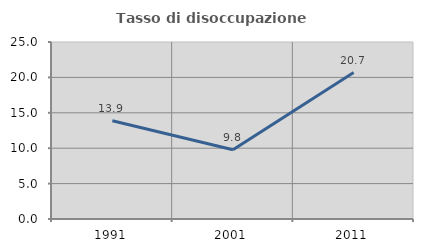
| Category | Tasso di disoccupazione giovanile  |
|---|---|
| 1991.0 | 13.885 |
| 2001.0 | 9.778 |
| 2011.0 | 20.678 |